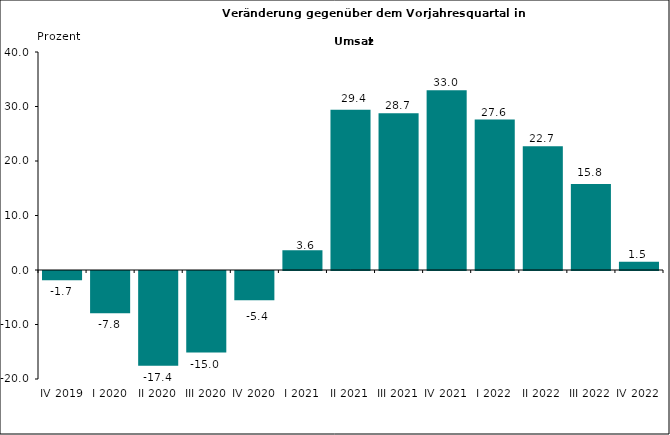
| Category | Series 0 |
|---|---|
| IV 2019 | -1.702 |
| I 2020 | -7.775 |
| II 2020 | -17.405 |
| III 2020 | -14.955 |
| IV 2020 | -5.368 |
| I 2021 | 3.627 |
| II 2021 | 29.396 |
| III 2021 | 28.748 |
| IV 2021 | 33 |
| I 2022 | 27.6 |
| II 2022 | 22.7 |
| III 2022 | 15.8 |
| IV 2022 | 1.5 |